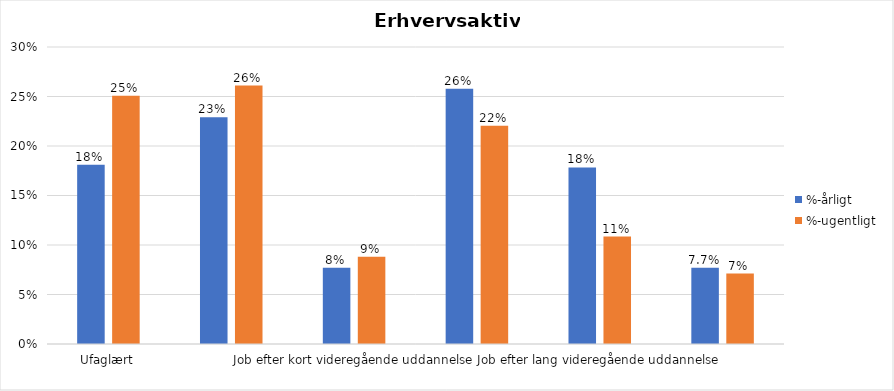
| Category | %-årligt | %-ugentligt |
|---|---|---|
| Ufaglært | 0.181 | 0.251 |
| Erhvervsfagligt job | 0.229 | 0.261 |
| Job efter kort videregående uddannelse | 0.077 | 0.088 |
| Job efter mellemlang videregående uddannelse | 0.258 | 0.22 |
| Job efter lang videregående uddannelse | 0.178 | 0.108 |
| Selvstændig | 0.077 | 0.071 |